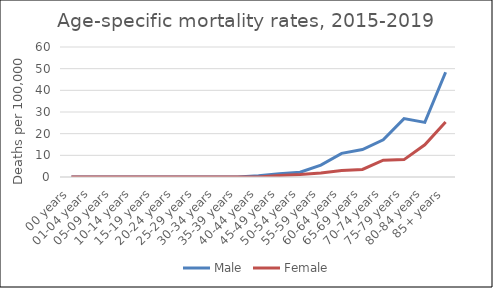
| Category | Male | Female |
|---|---|---|
| 00 years | 0 | 0 |
| 01-04 years | 0 | 0 |
| 05-09 years | 0 | 0 |
| 10-14 years | 0 | 0 |
| 15-19 years | 0 | 0 |
| 20-24 years | 0 | 0 |
| 25-29 years | 0 | 0 |
| 30-34 years | 0 | 0 |
| 35-39 years | 0 | 0 |
| 40-44 years | 0.62 | 0 |
| 45-49 years | 1.47 | 0.71 |
| 50-54 years | 2.23 | 1.13 |
| 55-59 years | 5.5 | 1.89 |
| 60-64 years | 10.91 | 3.01 |
| 65-69 years | 12.67 | 3.51 |
| 70-74 years | 17.18 | 7.78 |
| 75-79 years | 26.94 | 8.02 |
| 80-84 years | 25.19 | 14.88 |
| 85+ years | 48.35 | 25.36 |